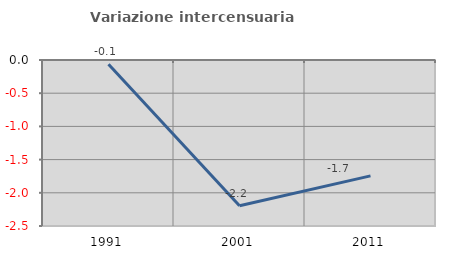
| Category | Variazione intercensuaria annua |
|---|---|
| 1991.0 | -0.063 |
| 2001.0 | -2.196 |
| 2011.0 | -1.745 |